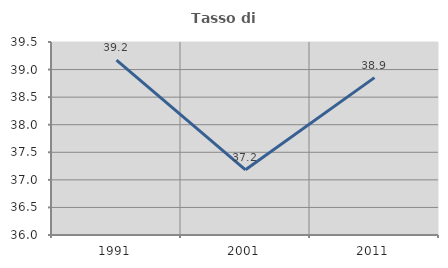
| Category | Tasso di occupazione   |
|---|---|
| 1991.0 | 39.173 |
| 2001.0 | 37.183 |
| 2011.0 | 38.854 |